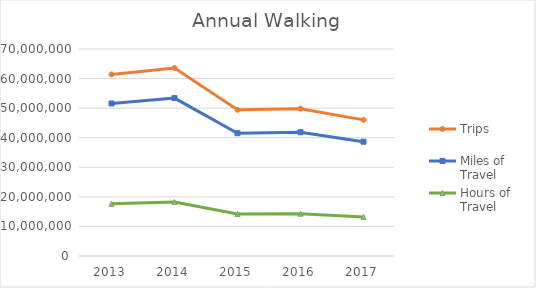
| Category | Trips | Miles of Travel | Hours of Travel |
|---|---|---|---|
| 2013 | 61399321.159 | 51573587.794 | 17638101.124 |
| 2014 | 63577024.628 | 53402793.376 | 18263687.095 |
| 2015 | 49426077.988 | 41516422.727 | 14198563.522 |
| 2016 | 49824955.464 | 41851467.842 | 14313148.523 |
| 2017 | 46036696.643 | 38669444.079 | 13224900.462 |